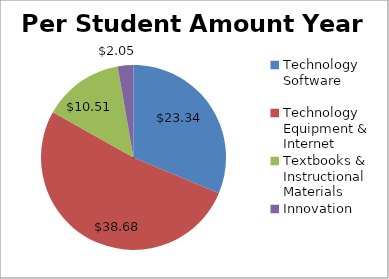
| Category | Per Student Amount Year Two |
|---|---|
| Technology Software | 23.34 |
| Technology Equipment & Internet | 38.68 |
| Textbooks & Instructional Materials | 10.51 |
| Innovation | 2.05 |